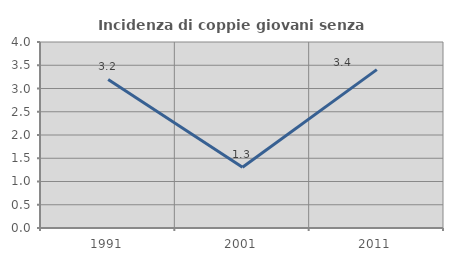
| Category | Incidenza di coppie giovani senza figli |
|---|---|
| 1991.0 | 3.194 |
| 2001.0 | 1.305 |
| 2011.0 | 3.406 |